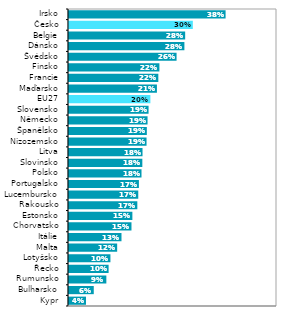
| Category | Series 0 |
|---|---|
| Kypr | 0.043 |
| Bulharsko | 0.062 |
| Rumunsko | 0.092 |
| Řecko | 0.098 |
| Lotyšsko | 0.102 |
| Malta | 0.118 |
| Itálie | 0.129 |
| Chorvatsko | 0.153 |
| Estonsko | 0.155 |
| Rakousko | 0.167 |
| Lucembursko | 0.169 |
| Portugalsko | 0.17 |
| Polsko | 0.177 |
| Slovinsko | 0.179 |
| Litva | 0.179 |
| Nizozemsko | 0.189 |
| Španělsko | 0.19 |
| Německo | 0.191 |
| Slovensko | 0.194 |
| EU27 | 0.198 |
| Maďarsko | 0.214 |
| Francie | 0.217 |
| Finsko | 0.22 |
| Švédsko | 0.261 |
| Dánsko | 0.28 |
| Belgie | 0.282 |
| Česko | 0.3 |
| Irsko | 0.379 |